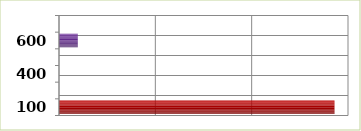
| Category | Series 0 |
|---|---|
| 100.0 | 2859858 |
| 200.0 | 0 |
| 400.0 | 0 |
| 500.0 | 0 |
| 600.0 | 195000 |
| 700.0 | 0 |